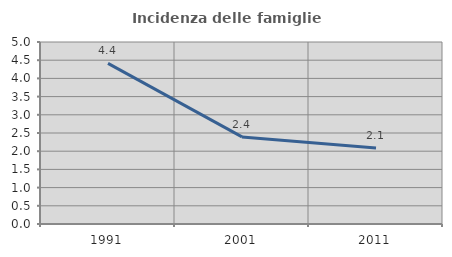
| Category | Incidenza delle famiglie numerose |
|---|---|
| 1991.0 | 4.411 |
| 2001.0 | 2.392 |
| 2011.0 | 2.085 |